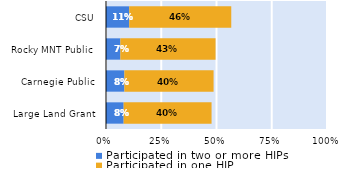
| Category | Participated in two or more HIPs | Participated in one HIP |
|---|---|---|
| Large Land Grant | 0.08 | 0.398 |
| Carnegie Public | 0.083 | 0.404 |
| Rocky MNT Public | 0.065 | 0.431 |
| CSU | 0.105 | 0.462 |